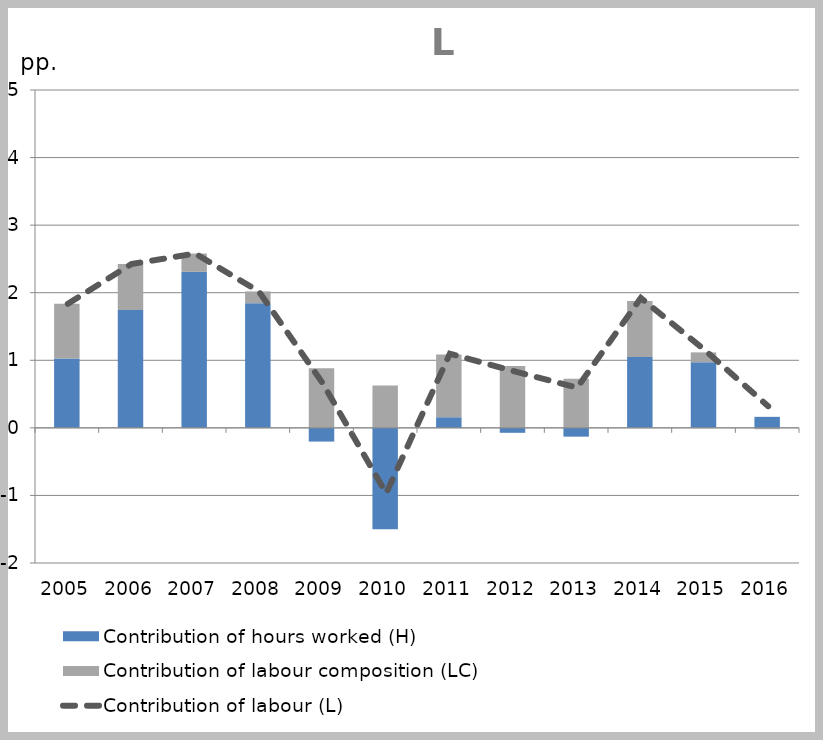
| Category | Contribution of hours worked (H) | Contribution of labour composition (LC) |
|---|---|---|
| 2005.0 | 1.025 | 0.81 |
| 2006.0 | 1.746 | 0.679 |
| 2007.0 | 2.308 | 0.272 |
| 2008.0 | 1.845 | 0.174 |
| 2009.0 | -0.203 | 0.881 |
| 2010.0 | -1.5 | 0.626 |
| 2011.0 | 0.157 | 0.93 |
| 2012.0 | -0.073 | 0.915 |
| 2013.0 | -0.13 | 0.728 |
| 2014.0 | 1.047 | 0.831 |
| 2015.0 | 0.971 | 0.146 |
| 2016.0 | 0.163 | -0.02 |